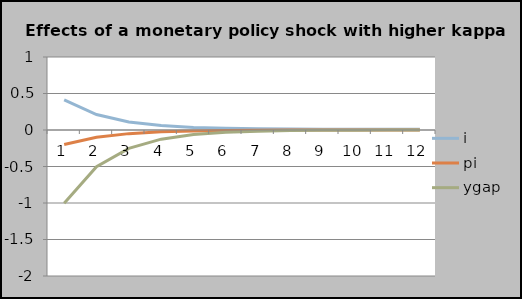
| Category | i | pi | ygap |
|---|---|---|---|
| 0 | 0.413 | -0.199 | -1.005 |
| 1 | 0.212 | -0.1 | -0.502 |
| 2 | 0.111 | -0.05 | -0.251 |
| 3 | 0.06 | -0.025 | -0.126 |
| 4 | 0.035 | -0.012 | -0.063 |
| 5 | 0.023 | -0.006 | -0.031 |
| 6 | 0.016 | -0.003 | -0.016 |
| 7 | 0.013 | -0.002 | -0.008 |
| 8 | 0.012 | -0.001 | -0.004 |
| 9 | 0.011 | 0 | -0.002 |
| 10 | 0.01 | 0 | -0.001 |
| 11 | 0.01 | 0 | 0 |